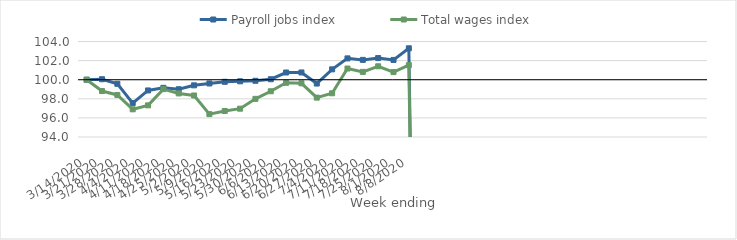
| Category | Payroll jobs index | Total wages index |
|---|---|---|
| 14/03/2020 | 100 | 100 |
| 21/03/2020 | 100.053 | 98.813 |
| 28/03/2020 | 99.569 | 98.406 |
| 04/04/2020 | 97.552 | 96.9 |
| 11/04/2020 | 98.878 | 97.316 |
| 18/04/2020 | 99.15 | 99.016 |
| 25/04/2020 | 99.003 | 98.567 |
| 02/05/2020 | 99.412 | 98.349 |
| 09/05/2020 | 99.608 | 96.397 |
| 16/05/2020 | 99.784 | 96.723 |
| 23/05/2020 | 99.833 | 96.967 |
| 30/05/2020 | 99.889 | 97.996 |
| 06/06/2020 | 100.051 | 98.792 |
| 13/06/2020 | 100.756 | 99.677 |
| 20/06/2020 | 100.761 | 99.623 |
| 27/06/2020 | 99.599 | 98.125 |
| 04/07/2020 | 101.089 | 98.581 |
| 11/07/2020 | 102.236 | 101.174 |
| 18/07/2020 | 102.08 | 100.822 |
| 25/07/2020 | 102.269 | 101.409 |
| 01/08/2020 | 102.074 | 100.801 |
| 08/08/2020 | 103.291 | 101.525 |